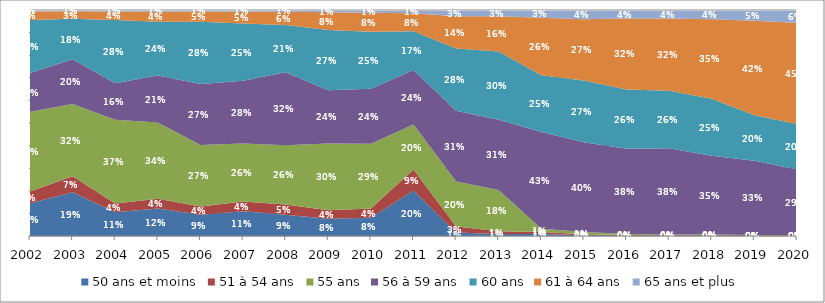
| Category | 50 ans et moins | 51 à 54 ans | 55 ans | 56 à 59 ans | 60 ans | 61 à 64 ans | 65 ans et plus |
|---|---|---|---|---|---|---|---|
| 2002.0 | 0.145 | 0.052 | 0.353 | 0.171 | 0.235 | 0.037 | 0.007 |
| 2003.0 | 0.193 | 0.072 | 0.319 | 0.198 | 0.179 | 0.034 | 0.005 |
| 2004.0 | 0.106 | 0.039 | 0.37 | 0.161 | 0.28 | 0.038 | 0.006 |
| 2005.0 | 0.122 | 0.043 | 0.338 | 0.208 | 0.238 | 0.045 | 0.007 |
| 2006.0 | 0.094 | 0.036 | 0.272 | 0.271 | 0.275 | 0.045 | 0.007 |
| 2007.0 | 0.109 | 0.043 | 0.257 | 0.278 | 0.253 | 0.052 | 0.008 |
| 2008.0 | 0.094 | 0.046 | 0.262 | 0.323 | 0.209 | 0.058 | 0.008 |
| 2009.0 | 0.076 | 0.038 | 0.296 | 0.236 | 0.266 | 0.078 | 0.01 |
| 2010.0 | 0.08 | 0.041 | 0.286 | 0.244 | 0.252 | 0.084 | 0.012 |
| 2011.0 | 0.201 | 0.093 | 0.199 | 0.241 | 0.172 | 0.08 | 0.014 |
| 2012.0 | 0.015 | 0.027 | 0.199 | 0.313 | 0.276 | 0.142 | 0.028 |
| 2013.0 | 0.009 | 0.012 | 0.182 | 0.311 | 0.302 | 0.157 | 0.027 |
| 2014.0 | 0.009 | 0.009 | 0.014 | 0.429 | 0.251 | 0.255 | 0.034 |
| 2015.0 | 0.003 | 0.004 | 0.01 | 0.397 | 0.274 | 0.271 | 0.041 |
| 2016.0 | 0.002 | 0.002 | 0.005 | 0.377 | 0.262 | 0.315 | 0.037 |
| 2017.0 | 0.002 | 0.003 | 0.002 | 0.381 | 0.255 | 0.319 | 0.037 |
| 2018.0 | 0.001 | 0.002 | 0.003 | 0.349 | 0.252 | 0.351 | 0.041 |
| 2019.0 | 0.001 | 0.002 | 0.002 | 0.328 | 0.201 | 0.418 | 0.048 |
| 2020.0 | 0.001 | 0.002 | 0.001 | 0.29 | 0.202 | 0.448 | 0.056 |